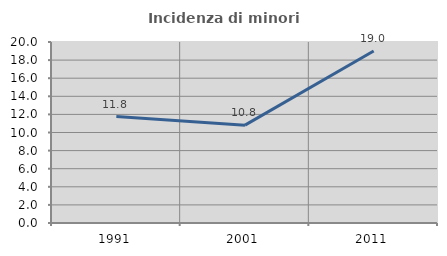
| Category | Incidenza di minori stranieri |
|---|---|
| 1991.0 | 11.765 |
| 2001.0 | 10.811 |
| 2011.0 | 19.01 |